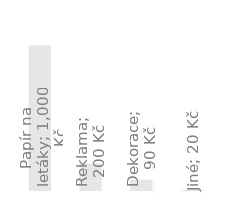
| Category | Roční výdaje |
|---|---|
| Papír na letáky | 1000 |
| Reklama | 200 |
| Dekorace | 90 |
| Jiné | 20 |